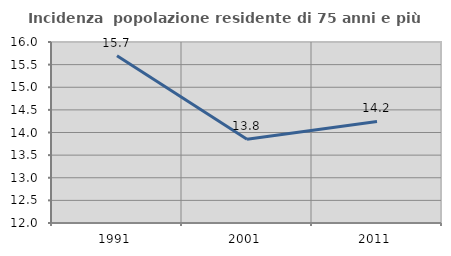
| Category | Incidenza  popolazione residente di 75 anni e più |
|---|---|
| 1991.0 | 15.699 |
| 2001.0 | 13.849 |
| 2011.0 | 14.245 |